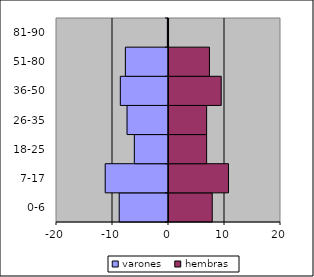
| Category | varones | hembras |
|---|---|---|
| 0-6 | -8.8 | 7.9 |
| 7-17 | -11.3 | 10.8 |
| 18-25 | -6.1 | 6.9 |
| 26-35 | -7.4 | 6.9 |
| 36-50 | -8.6 | 9.5 |
| 51-80 | -7.7 | 7.4 |
| 81-90 | -0.2 | 0.1 |